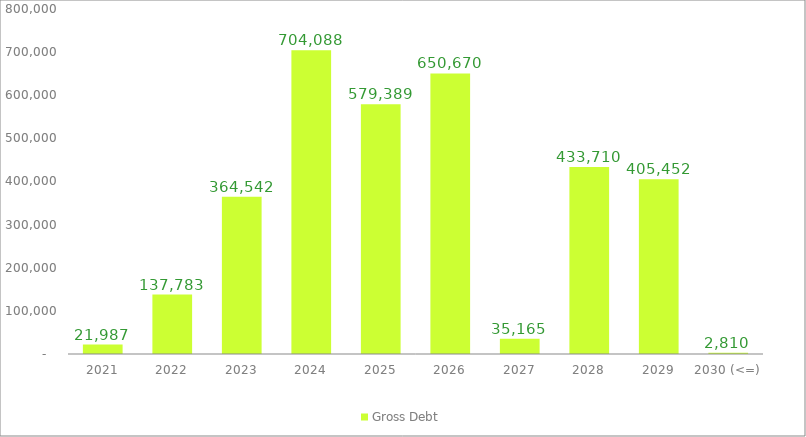
| Category | Gross Debt |
|---|---|
| 2021 | 21987.119 |
| 2022 | 137783.312 |
| 2023 | 364542.412 |
| 2024 | 704088.239 |
| 2025 | 579389.444 |
| 2026 | 650670.036 |
| 2027 | 35165.305 |
| 2028 | 433709.664 |
| 2029 | 405451.748 |
| 2030 (<=) | 2810.348 |